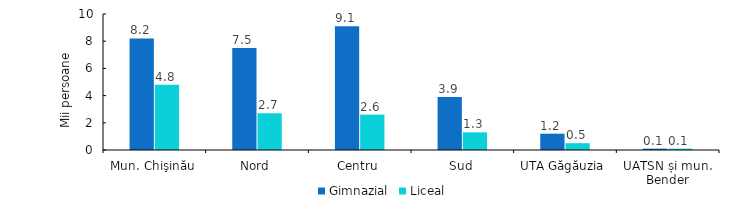
| Category | Gimnazial | Liceal |
|---|---|---|
| Mun. Chişinău | 8.2 | 4.8 |
| Nord | 7.5 | 2.7 |
| Centru | 9.1 | 2.6 |
| Sud | 3.9 | 1.3 |
| UTA Găgăuzia | 1.2 | 0.5 |
| UATSN și mun. Bender | 0.1 | 0.1 |